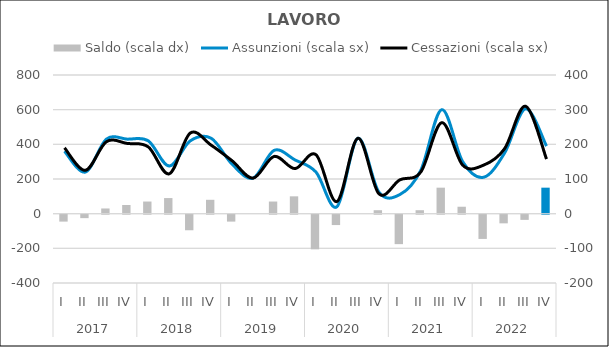
| Category | Saldo (scala dx) |
|---|---|
| 0 | -20 |
| 1 | -10 |
| 2 | 15 |
| 3 | 25 |
| 4 | 35 |
| 5 | 45 |
| 6 | -45 |
| 7 | 40 |
| 8 | -20 |
| 9 | 0 |
| 10 | 35 |
| 11 | 50 |
| 12 | -100 |
| 13 | -30 |
| 14 | 0 |
| 15 | 10 |
| 16 | -85 |
| 17 | 10 |
| 18 | 75 |
| 19 | 20 |
| 20 | -70 |
| 21 | -25 |
| 22 | -15 |
| 23 | 75 |